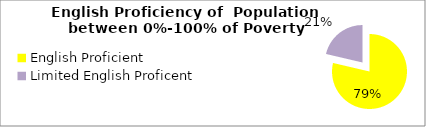
| Category | Percent |
|---|---|
| English Proficient | 0.787 |
| Limited English Proficent | 0.213 |